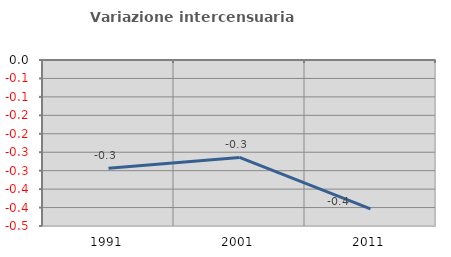
| Category | Variazione intercensuaria annua |
|---|---|
| 1991.0 | -0.293 |
| 2001.0 | -0.264 |
| 2011.0 | -0.403 |